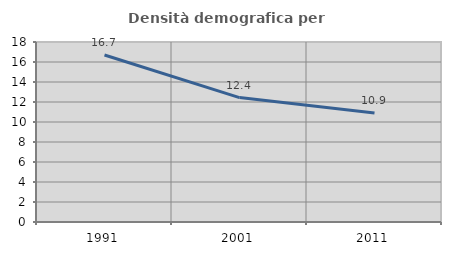
| Category | Densità demografica |
|---|---|
| 1991.0 | 16.696 |
| 2001.0 | 12.444 |
| 2011.0 | 10.893 |